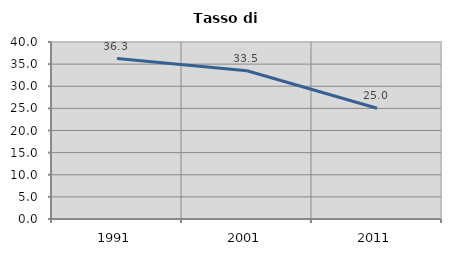
| Category | Tasso di disoccupazione   |
|---|---|
| 1991.0 | 36.268 |
| 2001.0 | 33.513 |
| 2011.0 | 25.016 |